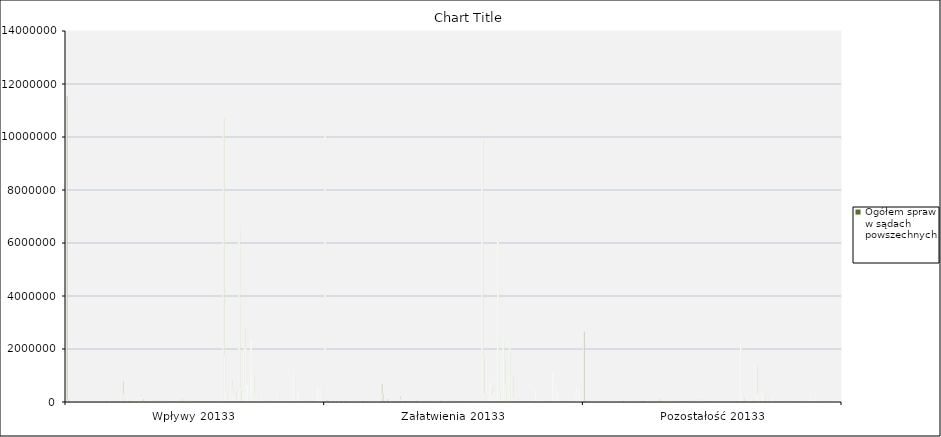
| Category | Ogółem spraw w sądach powszechnych | W sądach apelacyjnych
- Ogółem | Sprawy karne
- razem | A Ka s05a Wiersz 1 | odszkodowania A Ka s05a Wiersz 2 - formuła 3 + 4 | z ust. z dn. 23.02.1991 s05a Wiersz 3 | w tryb. art. 552 kpk  s05a Wiersz 4 | A Kz  s05a Wiersz 5 | A Ko s05a Wiersz 6 | s05a Wiersz 7 | art. 11a pwkpk s05a Wiersz 8 | A Kp s05a Wiersz 9 | A Kzw s05a Wiersz 10 | WKK  s05a Wiersz 11 | S  s05a Wiersz 12 | Sprawy cywilne
- razem | A Ca s01a Wiersz 1 | s01a Wiersz 2 | s01a Wiersz 3 | s01a Wiersz 4 | s01a Wiersz 5 | s01a Wiersz 6 | Sprawy z zakr. prawa pracy
- razem | s11a Wiersz 1 | s11a Wiersz 2 | s11a Wiersz 3 | s11a Wiersz 4 | s11a Wiersz 5 | s11a Wiersz 6 | Sprawy z zakresu ubezpieczeń społ.
- razem | Sprawy gospodarcze
- razem | s01a Wiersz 1 | W sądach okręgowych
- Ogółem | Sprawy karne i wykroczeniowe
- razem | K  s05o Wiersz 1 | odpowiedzialność podm. zbior.  s05o Wiersz 15 | Kow  s05o Wiersz 6 | Pen  s05o Wiersz 7 | Kp  s05o Wiersz 8 | Kop  s05o Wiersz 10 | Ka  s05o Wiersz 2 | Kz  s05o Wiersz 3 | Kzw  s05o Wiersz 5 | Ko  s05o Wiersz 4 | WKK  s05o Wiersz 9 | S  s05o Wiersz 14 | C  s01o Wiersz 1 | CG-G  s01o Wiersz 2 | Ns  s01o Wiersz 3 | rejestrowe  s01o Wiersz 4 | Prasa  s01o Wiersz 5 | Partie  s01o Wiersz 6 | FE  s01o Wiersz 7 | FI  s01o Wiersz 8 | Nc  s01o Wiersz 9 | Co I  s01o Wiersz 12 | WSC I  s01o Wiersz 15 | Ca  s01o Wiersz 10 | Cz  s01o Wiersz 11 | Co II  s01o Wiersz 13 | WSC  s01o Wiersz 14 | WSC II  s01o Wiersz 16 | S  s01o Wiersz 17 | Sprawy z zakresu prawa pracy
- razem | P  s11o Wiersz 1 | Np  s11o Wiersz 3 | Po I  s11o Wiersz 6 | Kas-z  s11o Wiersz 8 | WSC I  s11o Wiersz 10 | Pa  s11o Wiersz 4 | Pz  s11o Wiersz 5 | Po II  s11o Wiersz 7 | WSC  s11o Wiersz 9 | WSC II  s11o Wiersz 11 | S  s11o Wiersz 12 | Sprawy z zakresu ubezpiecze społ.
- razem | U  s11o Wiersz 1 | Uo I  s11o Wiersz 2 | WSC I  s11o Wiersz 7 | Ua  s11o Wiersz 4 | Uz  s11o Wiersz 5 | Uo II  s11o Wiersz 3 | WSC  s11o Wiersz 6 | WSC II  s11o Wiersz 8 | S  s11o Wiersz 9 | GC  s19o Wiersz 1 | GNs  s19o Wiersz 2 | GNc  s19o Wiersz 3 | U  s19o Wiersz 4 | GCo I  s19o Wiersz 5 | WSC I  s19o Wiersz 10 | GCa  s19o Wiersz 7 | GCz  s19o Wiersz 8 | GCo II  s19o Wiersz 6 | WSC  s19o Wiersz 9 | WSC II  s19o Wiersz 11 | S  s19o Wiersz 12 | Sprawy w Sądzie Ochrony Konkurencji i Konsumentów
- razem | s19k Wiersz 1 | s19k Wiersz 2 | s19k Wiersz 3 | s19k Wiersz 4 | s19k Wiersz 5 | s19k Wiersz 6 | s19k Wiersz 7 | s19k Wiersz 8 | Sprawy w Sądzie Wspólnotowych naków Towarowych ...
- razem | W sądach rejonowych
- Ogółem | K  s05r Wiersz 1a | podmioty zbiorowe  s05r Wiersz 2 | Ks przest.  s05r Wiersz 3a | Kp  s05r Wiersz 4 | Ko razem  s05r Wiersz 5 | Ko karne  s05r Wiersz 6 | Ko wykr.  s05r Wiersz 7 | W  s05r Wiersz 8 | Ks wykr.  s05r Wiersz 9a | Kop  s05r Wiersz 10 | C  s01r Wiersz 1 | CG-G  s01r Wiersz 3 | Ns  s01r Wiersz 4 | Nc  s01r Wiersz 5 | EPU cyw | Co  s01r Wiersz 6 | Cps  s01r Wiersz 7 | WSC  s01r Wiersz 8 | KW  s01r Wiersz 9 | Zd  s01r Wiersz 10 | Sprawy rodzinne
- razem | RC  s16r Wiersz 1 | RNs  s16r Wiersz 2 | Nsm  s16r Wiersz 3 | Npw  s18r w4+w5 | s18r Wiersz 4 | s18r Wiersz 5 | Now  s16r w6+w7 | s18r Wiersz 6 | s16r Wiersz 7 | Nk  s16r Wiersz 8 | Nkd  s18r Wiersz 09 | s18r Wiersz 09 | RNc  s16r Wiersz 9 | RCo  s16r Wiersz 10 | Nmo  s16r Wiersz 11 | RCps  s16r Wiersz 12 | posiedzenia   s16r Wiersz 13 | wykonawcze merytoryczne | WSC  s16r Wiersz 14 | P  s12r Wiersz 1 | Np  s12r Wiersz 4 | EPU prawo pracy | Po  s12r Wiersz 5 | WSC  s12r Wiersz 6 | Sprawy z zakr. ubezpieczeń społ.
- razem | U  s11r Wiersz 1 | Uo  s11r Wiersz 2 | WSC  s11r Wiersz 3 | GC  s16r Wiersz 1 | GNs  s16r Wiersz 3 | GNc  s16r Wiersz 4 | EPU gosp | GCo  s16r Wiersz 5 | GCps  s16r Wiersz 6 | postępowanie upadłościowe | GU  s20UN Wiersz 8 | GUp  s20UN Wiersz 9 | GN  s20UN Wiersz 10 | GZd  s20UN Wiersz 11 | GUo  s20UN Wiersz 12 | GUu  s20UN Wiersz 13 | GUz  s20UN Wiersz 14 | GUk  s20UN Wiersz 15 | U+Ukł  s20UN Wiersz 16 | WSC  s19r+s20UN Wiersz 17 | rejestrowe  Suma W20+W21 | s20Z Wiersz 20 | KRS  Suma KRS Wiersz 21 | rozwody i separacje |
|---|---|---|---|---|---|---|---|---|---|---|---|---|---|---|---|---|---|---|---|---|---|---|---|---|---|---|---|---|---|---|---|---|---|---|---|---|---|---|---|---|---|---|---|---|---|---|---|---|---|---|---|---|---|---|---|---|---|---|---|---|---|---|---|---|---|---|---|---|---|---|---|---|---|---|---|---|---|---|---|---|---|---|---|---|---|---|---|---|---|---|---|---|---|---|---|---|---|---|---|---|---|---|---|---|---|---|---|---|---|---|---|---|---|---|---|---|---|---|---|---|---|---|---|---|---|---|---|---|---|---|---|---|---|---|---|---|---|---|---|---|---|---|---|---|---|---|---|---|---|---|---|---|---|---|---|---|---|---|---|---|---|---|---|---|---|---|---|---|---|---|---|---|---|---|---|---|---|---|
| Wpływy 20133 | 11535384 | 90210 | 26014 | 2846 | 291 | 73 | 218 | 5044 | 1582 | 0 | 1 | 376 | 15301 | 446 | 419 | 6634744 | 11236 | 4877 | 16 | 442 | 3 | 158 | 77689 | 20484 | 2985 | 31 | 1175 | 20 | 135 | 24830 | 1155617 | 2382 | 759953 | 1742457 | 7088 | 0 | 112675 | 26062 | 26660 | 3753 | 39472 | 24945 | 27429 | 28112 | 953 | 1540 | 107014 | 150 | 11758 | 6423 | 3800 | 56 | 53 | 2514 | 10158 | 10029 | 19 | 43689 | 49064 | 330 | 1144 | 193 | 4462 | 12237 | 1558 | 64 | 561 | 4 | 0 | 6866 | 2382 | 53 | 611 | 30 | 108 | 124911 | 118186 | 4603 | 6 | 1753 | 280 | 6 | 57 | 2 | 18 | 12732 | 11 | 14548 | 0 | 3304 | 0 | 7796 | 7296 | 88 | 81 | 34 | 227 | 33459 | 33038 | 106 | 16 | 127 | 77 | 78 | 17 | 0 | 107 | 10685221 | 338133 | 19 | 13346 | 156426 | 812768 | 539722 | 273046 | 433730 | 39242 | 1400 | 454367 | 110 | 369897 | 2754474 | 2014719 | 650729 | 18071 | 54 | 2385752 | 1290 | 1048470 | 135093 | 111816 | 156960 | 59339 | 25365 | 33974 | 38889 | 19060 | 19829 | 504 |  |  | 0 | 9415 | 51534 | 33733 | 451183 | 66832 | 4 | 56408 | 12775 | 245 | 8502 | 4 | 26244 | 24379 | 1865 | 0 | 78774 | 207 | 467961 | 244238 | 35682 | 3161 | 8499 | 3613 | 748 | 20 | 1201 | 509 | 81 | 871 | 1454 | 2 | 3 | 561330 | 68935 | 492395 | 72352 |
| Załatwienia 20133 | 10717175 | 76709 | 24796 | 2487 | 265 | 67 | 198 | 5023 | 1525 | 0 | 1 | 369 | 14518 | 462 | 412 | 6104434 | 9089 | 4147 | 18 | 401 | 3 | 139 | 75573 | 13088 | 2923 | 27 | 1173 | 18 | 147 | 17376 | 1093175 | 1907 | 688930 | 1654295 | 6877 | 0 | 110943 | 25788 | 25964 | 3683 | 36295 | 24832 | 27751 | 27340 | 937 | 1428 | 97675 | 74 | 10639 | 6331 | 3726 | 72 | 52 | 2481 | 11365 | 9719 | 18 | 37152 | 45373 | 331 | 1079 | 194 | 4213 | 10899 | 1513 | 62 | 472 | 3 | 0 | 5832 | 2232 | 54 | 595 | 27 | 109 | 105634 | 99284 | 4500 | 4 | 1496 | 268 | 5 | 55 | 4 | 18 | 9799 | 13 | 16725 | 1 | 3238 | 0 | 7245 | 6967 | 78 | 71 | 38 | 239 | 11876 | 11481 | 124 | 4 | 151 | 56 | 43 | 17 | 0 | 106 | 9951536 | 315847 | 13 | 11934 | 151409 | 783943 | 522061 | 261882 | 401882 | 34896 | 1214 | 363982 | 81 | 336693 | 2430443 | 1642391 | 606401 | 16855 | 51 | 2348674 | 1254 | 1002657 | 119158 | 104343 | 140673 | 57353 | 24375 | 32978 | 37143 | 18074 | 19069 | 487 |  |  | 0 | 8498 | 50900 | 32914 | 451183 | 66832 | 5 | 53829 | 14090 | 168 | 7652 | 2 | 21402 | 19866 | 1536 | 0 | 65318 | 179 | 458727 | 201579 | 29263 | 2702 | 7625 | 3432 | 478 | 24 | 1007 | 456 | 75 | 620 | 1507 | 26 | 30 | 529331 | 68533 | 460798 | 66608 |
| Pozostałość 20133 | 2654142 | 33981 | 3641 | 764 | 55 | 13 | 42 | 266 | 282 | 0 | 0 | 18 | 2154 | 109 | 48 | 1389273 | 5914 | 1026 | 0 | 105 | 0 | 23 | 41074 | 18221 | 301 | 7 | 169 | 2 | 19 | 18719 | 215832 | 1423 | 324434 | 423043 | 6111 | 0 | 17549 | 1136 | 1534 | 535 | 11937 | 1875 | 3848 | 3825 | 289 | 241 | 94417 | 232 | 6623 | 435 | 300 | 9 | 3 | 123 | 1186 | 2094 | 3 | 20128 | 8794 | 26 | 284 | 54 | 693 | 4783 | 1510 | 13 | 117 | 1 | 0 | 2710 | 319 | 2 | 102 | 5 | 4 | 84314 | 82308 | 1256 | 2 | 705 | 28 | 1 | 13 | 0 | 1 | 13242 | 2 | 1765 | 5 | 487 | 1 | 3154 | 1092 | 16 | 26 | 4 | 21 | 31639 | 30786 | 258 | 25 | 300 | 163 | 107 | 0 | 0 | 34 | 2295727 | 171130 | 14 | 6125 | 19558 | 110404 | 79728 | 30676 | 121574 | 11935 | 377 | 293721 | 169 | 157885 | 537394 | 445288 | 198573 | 5385 | 11 | 196013 | 122 | 207184 | 70654 | 33170 | 63583 | 17967 | 7291 | 10676 | 8644 | 4168 | 4476 | 285 |  |  | 1 | 3246 | 5276 | 4354 | 0 | 0 | 4 | 38247 | 1015 | 83 | 1810 | 2 | 19321 | 18708 | 613 | 0 | 60054 | 149 | 78085 | 49501 | 10901 | 1356 | 5912 | 1175 | 2580 | 4 | 793 | 120 | 31 | 484 | 614 | 111 | 1 | 59374 | 3194 | 56180 | 53333 |